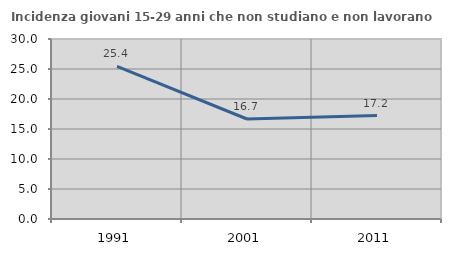
| Category | Incidenza giovani 15-29 anni che non studiano e non lavorano  |
|---|---|
| 1991.0 | 25.448 |
| 2001.0 | 16.667 |
| 2011.0 | 17.241 |